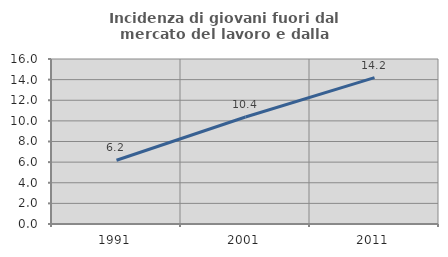
| Category | Incidenza di giovani fuori dal mercato del lavoro e dalla formazione  |
|---|---|
| 1991.0 | 6.186 |
| 2001.0 | 10.374 |
| 2011.0 | 14.193 |